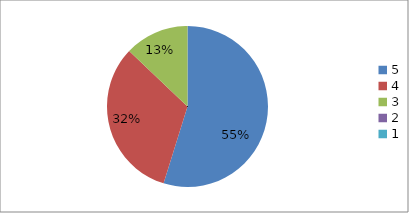
| Category | Series 0 | Series 1 |
|---|---|---|
| 5.0 | 54.8 | 54.8 |
| 4.0 | 32.3 | 32.3 |
| 3.0 | 12.9 | 12.9 |
| 2.0 | 0 | 0 |
| 1.0 | 0 | 0 |